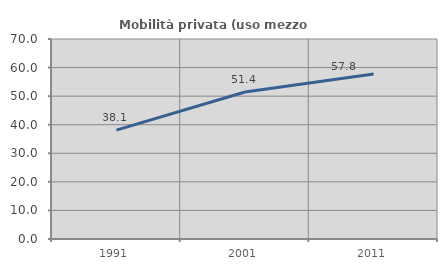
| Category | Mobilità privata (uso mezzo privato) |
|---|---|
| 1991.0 | 38.095 |
| 2001.0 | 51.448 |
| 2011.0 | 57.753 |